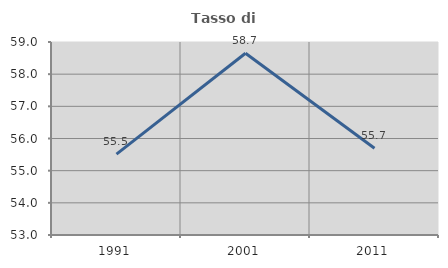
| Category | Tasso di occupazione   |
|---|---|
| 1991.0 | 55.515 |
| 2001.0 | 58.652 |
| 2011.0 | 55.696 |